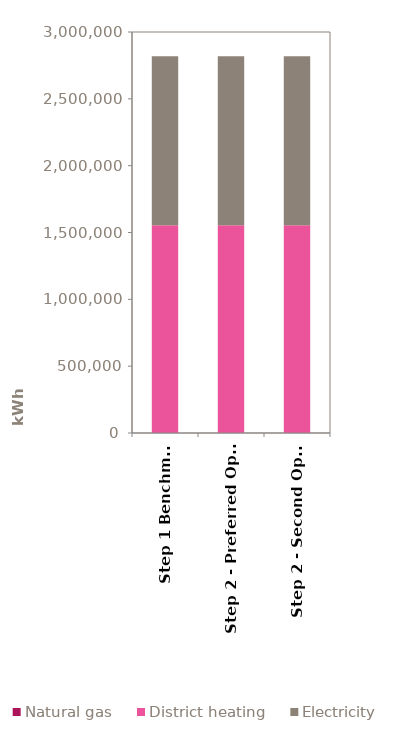
| Category | Natural gas | District heating | Electricity |
|---|---|---|---|
| Step 1 Benchmark | 0 | 1554790 | 1264581 |
| Step 2 - Preferred Option | 0 | 1554790 | 1264581 |
| Step 2 - Second Option | 0 | 1554790 | 1264581 |